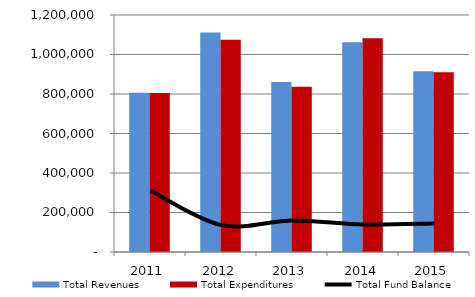
| Category |  Total Revenues  |  Total Expenditures  |
|---|---|---|
| 2011.0 | 806194 | 805560 |
| 2012.0 | 1111077 | 1075115 |
| 2013.0 | 860526 | 836776 |
| 2014.0 | 1061428 | 1082171 |
| 2015.0 | 915176 | 910048 |